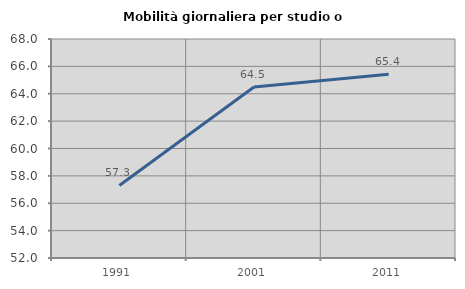
| Category | Mobilità giornaliera per studio o lavoro |
|---|---|
| 1991.0 | 57.3 |
| 2001.0 | 64.493 |
| 2011.0 | 65.43 |